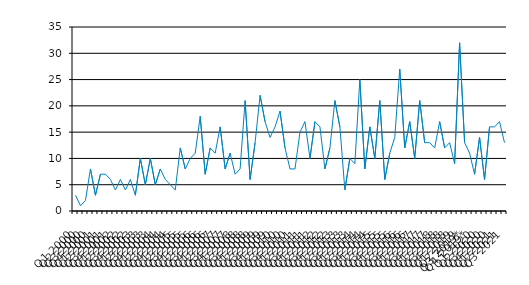
| Category | Series 0 |
|---|---|
| Q1 2000 | 3 |
| Q2 2000 | 1 |
| Q3 2000 | 2 |
| Q4 2000 | 8 |
| Q1 2001 | 3 |
| Q2 2001 | 7 |
| Q3 2001 | 7 |
| Q4 2001 | 6 |
| Q1 2002 | 4 |
| Q2 2002 | 6 |
| Q3 2002 | 4 |
| Q4 2002 | 6 |
| Q1 2003 | 3 |
| Q2 2003 | 10 |
| Q3 2003 | 5 |
| Q4 2003 | 10 |
| Q1 2004 | 5 |
| Q2 2004 | 8 |
| Q3 2004 | 6 |
| Q4 2004 | 5 |
| Q1 2005 | 4 |
| Q2 2005 | 12 |
| Q3 2005 | 8 |
| Q4 2005 | 10 |
| Q1 2006 | 11 |
| Q2 2006 | 18 |
| Q3 2006 | 7 |
| Q4 2006 | 12 |
| Q1 2007 | 11 |
| Q2 2007 | 16 |
| Q3 2007 | 8 |
| Q4 2007 | 11 |
| Q1 2008 | 7 |
| Q2 2008 | 8 |
| Q3 2008 | 21 |
| Q4 2008 | 6 |
| Q1 2009 | 13 |
| Q2 2009 | 22 |
| Q3 2009 | 17 |
| Q4 2009 | 14 |
| Q1 2010 | 16 |
| Q2 2010 | 19 |
| Q3 2010 | 12 |
| Q4 2010 | 8 |
| Q1 2011 | 8 |
| Q2 2011 | 15 |
| Q3 2011 | 17 |
| Q4 2011 | 10 |
| Q1 2012 | 17 |
| Q2 2012 | 16 |
| Q3 2012 | 8 |
| Q4 2012 | 12 |
| Q1 2013 | 21 |
| Q2 2013 | 16 |
| Q3 2013 | 4 |
| Q4 2013 | 10 |
| Q1 2014 | 9 |
| Q2 2014 | 25 |
| Q3 2014 | 8 |
| Q4 2014 | 16 |
| Q1 2015 | 10 |
| Q2 2015 | 21 |
| Q3 2015 | 6 |
| Q4 2015 | 11 |
| Q1 2016 | 14 |
| Q2 2016 | 27 |
| Q3 2016 | 12 |
| Q4 2016 | 17 |
| Q1 2017 | 10 |
| Q2 2017 | 21 |
| Q3 2017 | 13 |
| Q4 2017 | 13 |
| Q1 2018 | 12 |
| Q2 2018 | 17 |
| Q3 2018 | 12 |
| Q4 2018 | 13 |
| Q1 2019 | 9 |
| Q2 2019 | 32 |
| Q3 2019* | 13 |
| Q4 2019* | 11 |
| Q1 2020 | 7 |
| Q2 2020 | 14 |
| Q3 2020 | 6 |
| Q4 2020 | 16 |
| Q1 2021 | 16 |
| Q2 2021 | 17 |
| Q3 2021 | 13 |